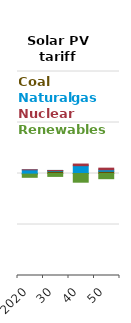
| Category | Coal | Gas & oil | Nuclear | Renewables |
|---|---|---|---|---|
| 2020.0 | -2.453 | 14.44 | 0.014 | -12.481 |
| 30.0 | 9.301 | 2.673 | 0.004 | -11.409 |
| 40.0 | 0.306 | 30.33 | 6.415 | -34.139 |
| 50.0 | 8.664 | 5.909 | 6.399 | -20.39 |